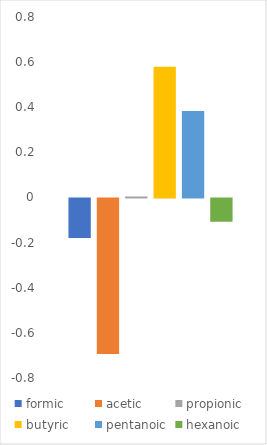
| Category | formic | acetic | propionic | butyric | pentanoic | hexanoic |
|---|---|---|---|---|---|---|
| PC1 | -0.175 | -0.69 | 0.005 | 0.58 | 0.384 | -0.103 |